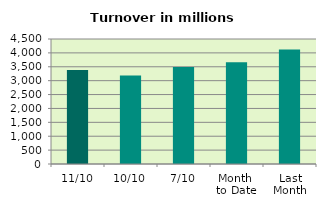
| Category | Series 0 |
|---|---|
| 11/10 | 3382.676 |
| 10/10 | 3184.351 |
| 7/10 | 3492.063 |
| Month 
to Date | 3666.18 |
| Last
Month | 4119.728 |